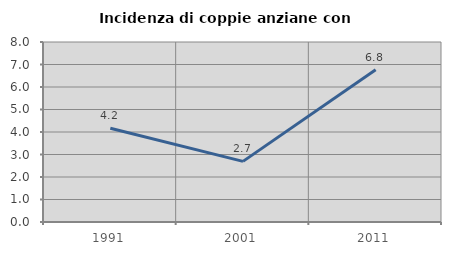
| Category | Incidenza di coppie anziane con figli |
|---|---|
| 1991.0 | 4.167 |
| 2001.0 | 2.695 |
| 2011.0 | 6.765 |